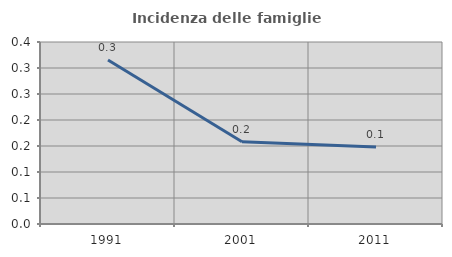
| Category | Incidenza delle famiglie numerose |
|---|---|
| 1991.0 | 0.315 |
| 2001.0 | 0.158 |
| 2011.0 | 0.148 |